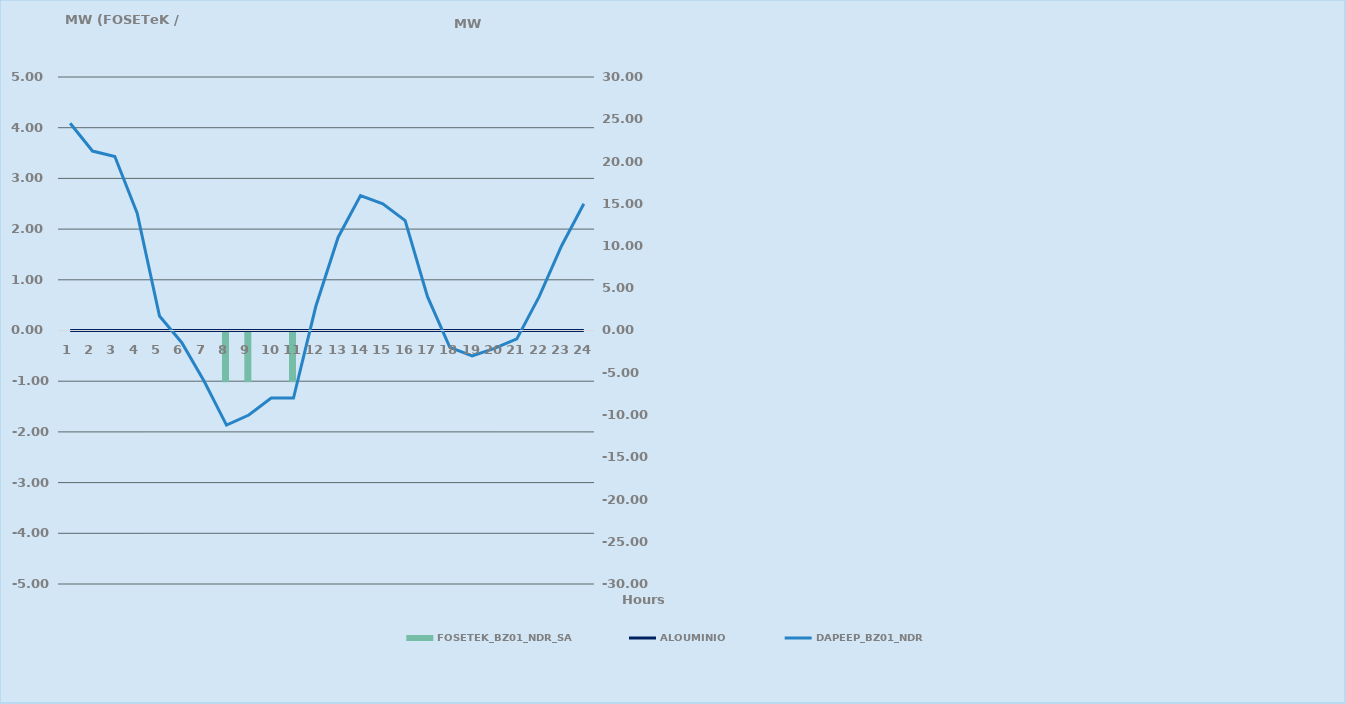
| Category | FOSETEK_BZ01_NDR_SA |
|---|---|
| 0 | 0 |
| 1 | 0 |
| 2 | 0 |
| 3 | 0 |
| 4 | 0 |
| 5 | 0 |
| 6 | 0 |
| 7 | -1 |
| 8 | -1 |
| 9 | 0 |
| 10 | -1 |
| 11 | 0 |
| 12 | 0 |
| 13 | 0 |
| 14 | 0 |
| 15 | 0 |
| 16 | 0 |
| 17 | 0 |
| 18 | 0 |
| 19 | 0 |
| 20 | 0 |
| 21 | 0 |
| 22 | 0 |
| 23 | 0 |